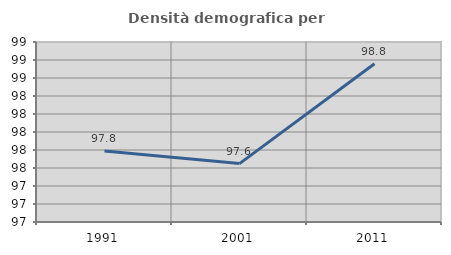
| Category | Densità demografica |
|---|---|
| 1991.0 | 97.788 |
| 2001.0 | 97.649 |
| 2011.0 | 98.759 |